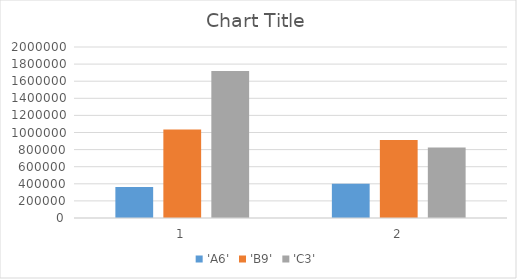
| Category | 'A6' | 'B9' | 'C3' |
|---|---|---|---|
| 0 | 363661.5 | 1034639.875 | 1719043.667 |
| 1 | 400092.786 | 911020.562 | 824987.556 |